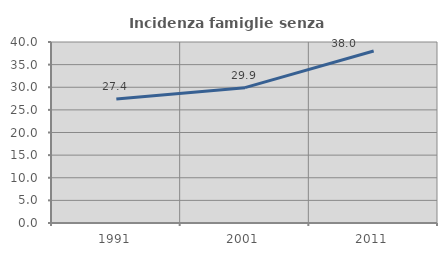
| Category | Incidenza famiglie senza nuclei |
|---|---|
| 1991.0 | 27.409 |
| 2001.0 | 29.915 |
| 2011.0 | 38.015 |